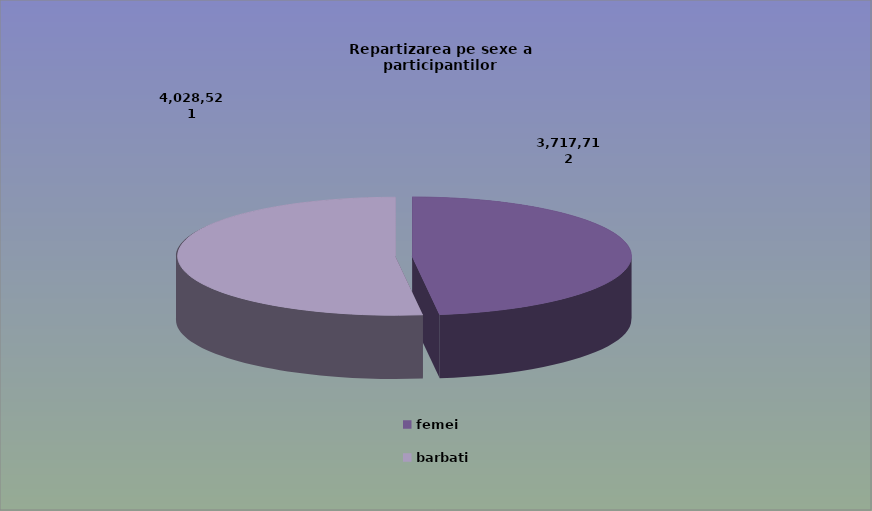
| Category | Series 0 |
|---|---|
| femei | 3717712 |
| barbati | 4028521 |